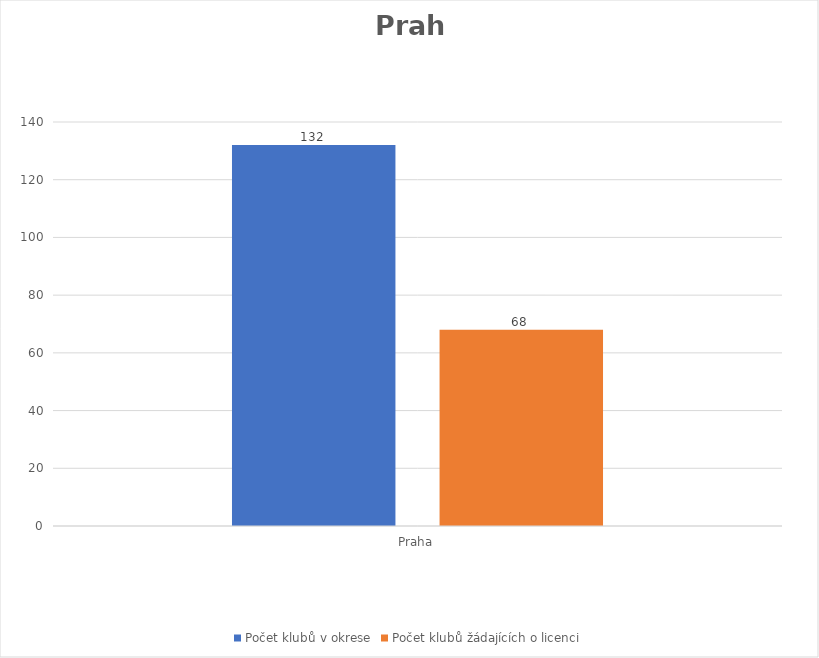
| Category | Počet klubů v okrese | Počet klubů žádajících o licenci |
|---|---|---|
| Praha | 132 | 68 |